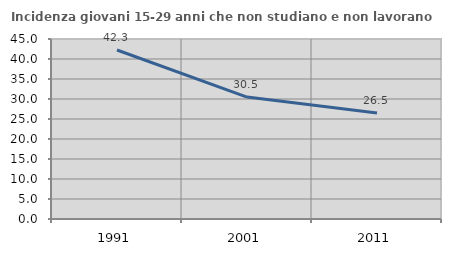
| Category | Incidenza giovani 15-29 anni che non studiano e non lavorano  |
|---|---|
| 1991.0 | 42.256 |
| 2001.0 | 30.476 |
| 2011.0 | 26.506 |